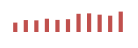
| Category | Importações (2) |
|---|---|
| 0 | 62681.056 |
| 1 | 79621.593 |
| 2 | 77709.867 |
| 3 | 88593.929 |
| 4 | 80744.22 |
| 5 | 85348.563 |
| 6 | 121368.935 |
| 7 | 124143.971 |
| 8 | 115571.707 |
| 9 | 108842.355 |
| 10 | 136096.08 |